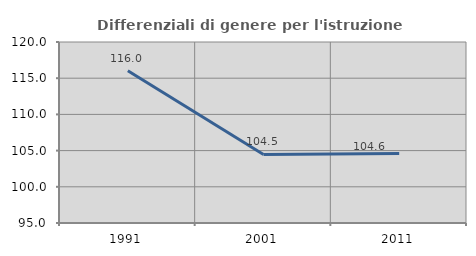
| Category | Differenziali di genere per l'istruzione superiore |
|---|---|
| 1991.0 | 116.029 |
| 2001.0 | 104.475 |
| 2011.0 | 104.601 |